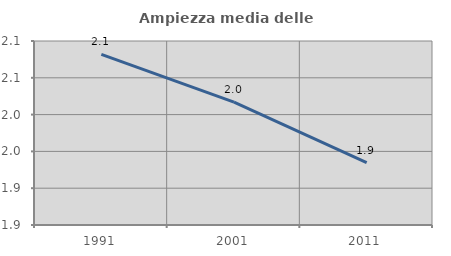
| Category | Ampiezza media delle famiglie |
|---|---|
| 1991.0 | 2.082 |
| 2001.0 | 2.017 |
| 2011.0 | 1.935 |